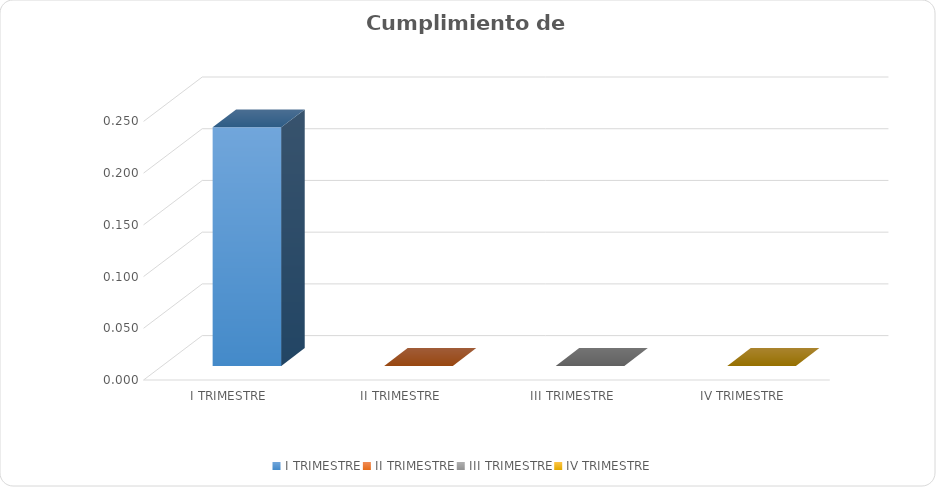
| Category | Series 0 |
|---|---|
| I TRIMESTRE | 0.231 |
| II TRIMESTRE | 0 |
| III TRIMESTRE | 0 |
| IV TRIMESTRE | 0 |